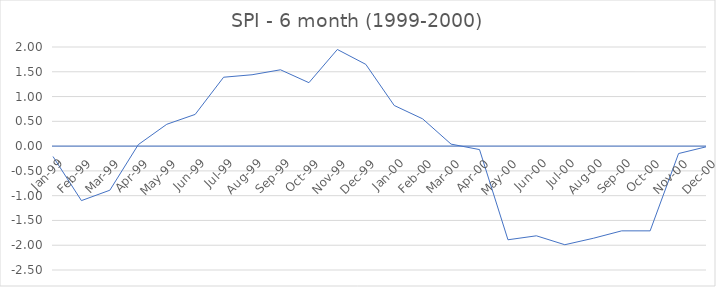
| Category | SPI - 4 month |
|---|---|
| Jan-99 | -0.21 |
| Feb-99 | -1.1 |
| Mar-99 | -0.89 |
| Apr-99 | 0.03 |
| May-99 | 0.44 |
| Jun-99 | 0.64 |
| Jul-99 | 1.39 |
| Aug-99 | 1.44 |
| Sep-99 | 1.54 |
| Oct-99 | 1.28 |
| Nov-99 | 1.95 |
| Dec-99 | 1.65 |
| Jan-00 | 0.82 |
| Feb-00 | 0.55 |
| Mar-00 | 0.04 |
| Apr-00 | -0.07 |
| May-00 | -1.89 |
| Jun-00 | -1.81 |
| Jul-00 | -1.99 |
| Aug-00 | -1.86 |
| Sep-00 | -1.71 |
| Oct-00 | -1.71 |
| Nov-00 | -0.15 |
| Dec-00 | -0.01 |